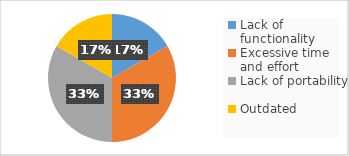
| Category | Series 0 |
|---|---|
| Lack of functionality | 1 |
| Excessive time and effort | 2 |
| Lack of portability | 2 |
| Outdated | 1 |